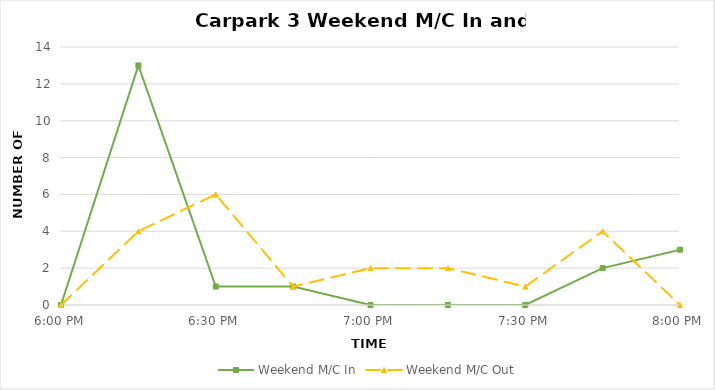
| Category | Weekend M/C In | Weekend M/C Out |
|---|---|---|
| 0.75 | 0 | 0 |
| 0.760416666666667 | 13 | 4 |
| 0.770833333333333 | 1 | 6 |
| 0.78125 | 1 | 1 |
| 0.791666666666667 | 0 | 2 |
| 0.802083333333333 | 0 | 2 |
| 0.8125 | 0 | 1 |
| 0.822916666666667 | 2 | 4 |
| 0.833333333333333 | 3 | 0 |